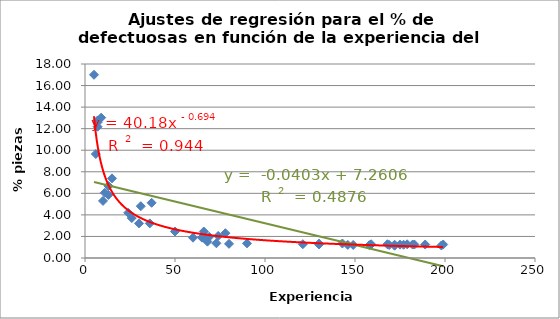
| Category | Series 0 |
|---|---|
| 175.0 | 1.242 |
| 50.0 | 2.46 |
| 168.0 | 1.275 |
| 183.0 | 1.25 |
| 30.0 | 3.211 |
| 78.0 | 2.301 |
| 69.0 | 1.967 |
| 179.0 | 1.271 |
| 65.0 | 1.884 |
| 7.0 | 12.182 |
| 26.0 | 3.706 |
| 9.0 | 13.022 |
| 199.0 | 1.254 |
| 66.0 | 2.061 |
| 182.0 | 1.246 |
| 7.0 | 12.764 |
| 130.0 | 1.259 |
| 60.0 | 1.884 |
| 158.0 | 1.193 |
| 189.0 | 1.25 |
| 159.0 | 1.271 |
| 80.0 | 1.314 |
| 13.0 | 6.686 |
| 146.0 | 1.213 |
| 6.0 | 9.647 |
| 15.0 | 7.389 |
| 121.0 | 1.28 |
| 172.0 | 1.143 |
| 130.0 | 1.332 |
| 198.0 | 1.158 |
| 68.0 | 1.517 |
| 74.0 | 2.048 |
| 67.0 | 1.762 |
| 10.0 | 5.294 |
| 36.0 | 3.211 |
| 177.0 | 1.234 |
| 143.0 | 1.345 |
| 172.0 | 1.234 |
| 11.0 | 6.05 |
| 90.0 | 1.359 |
| 73.0 | 1.363 |
| 66.0 | 2.46 |
| 7.0 | 12.595 |
| 149.0 | 1.209 |
| 24.0 | 4.193 |
| 31.0 | 4.807 |
| 169.0 | 1.209 |
| 37.0 | 5.121 |
| 13.0 | 5.851 |
| 5.0 | 17.002 |